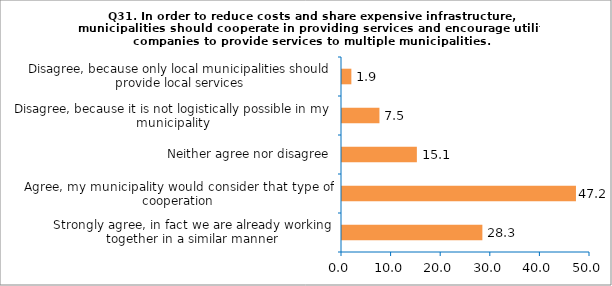
| Category | Series 0 |
|---|---|
| Strongly agree, in fact we are already working together in a similar manner | 28.302 |
| Agree, my municipality would consider that type of cooperation | 47.17 |
| Neither agree nor disagree | 15.094 |
| Disagree, because it is not logistically possible in my municipality | 7.547 |
| Disagree, because only local municipalities should provide local services | 1.887 |